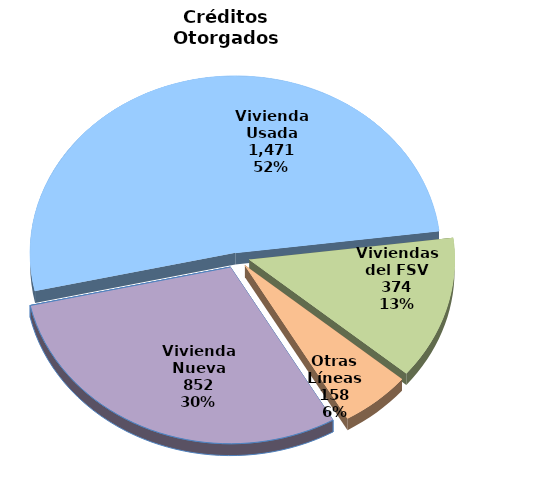
| Category | Series 0 |
|---|---|
| Vivienda Nueva | 852 |
| Vivienda Usada | 1471 |
| Viviendas del FSV | 374 |
| Otras Líneas | 158 |